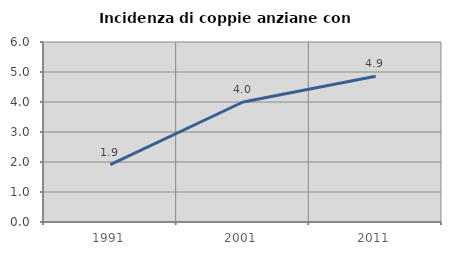
| Category | Incidenza di coppie anziane con figli |
|---|---|
| 1991.0 | 1.911 |
| 2001.0 | 4 |
| 2011.0 | 4.857 |